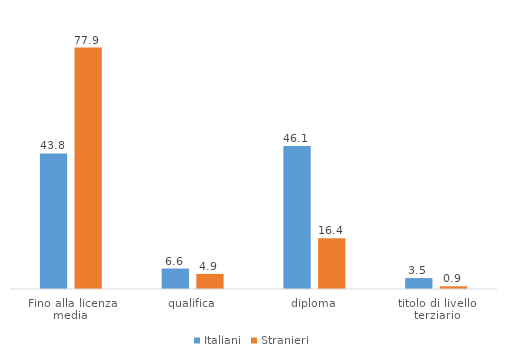
| Category | Italiani | Stranieri |
|---|---|---|
| Fino alla licenza media  | 43.75 | 77.876 |
| qualifica | 6.602 | 4.867 |
| diploma | 46.127 | 16.372 |
| titolo di livello terziario | 3.521 | 0.885 |